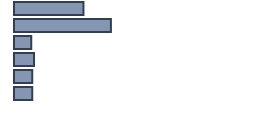
| Category | Percentatge |
|---|---|
| 0 | 28.939 |
| 1 | 40.379 |
| 2 | 7.197 |
| 3 | 8.333 |
| 4 | 7.576 |
| 5 | 7.576 |
| 6 | 0 |